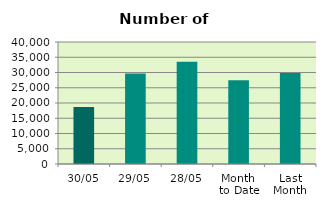
| Category | Series 0 |
|---|---|
| 30/05 | 18694 |
| 29/05 | 29668 |
| 28/05 | 33522 |
| Month 
to Date | 27451.714 |
| Last
Month | 29833 |